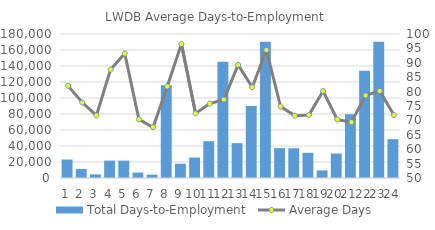
| Category | Total Days-to-Employment |
|---|---|
| 0 | 23120 |
| 1 | 11202 |
| 2 | 4518 |
| 3 | 21735 |
| 4 | 21721 |
| 5 | 6823 |
| 6 | 4193 |
| 7 | 115981 |
| 8 | 17858 |
| 9 | 25570 |
| 10 | 45963 |
| 11 | 145335 |
| 12 | 43568 |
| 13 | 90085 |
| 14 | 170328 |
| 15 | 37327 |
| 16 | 37189 |
| 17 | 31489 |
| 18 | 9461 |
| 19 | 30580 |
| 20 | 79724 |
| 21 | 134072 |
| 22 | 170223 |
| 23 | 48491 |